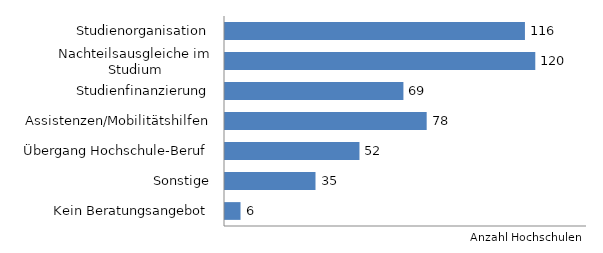
| Category | Series 0 |
|---|---|
| Studienorganisation | 116 |
| Nachteilsausgleiche im Studium | 120 |
| Studienfinanzierung | 69 |
| Assistenzen/Mobilitätshilfen | 78 |
| Übergang Hochschule-Beruf | 52 |
| Sonstige | 35 |
| Kein Beratungsangebot | 6 |